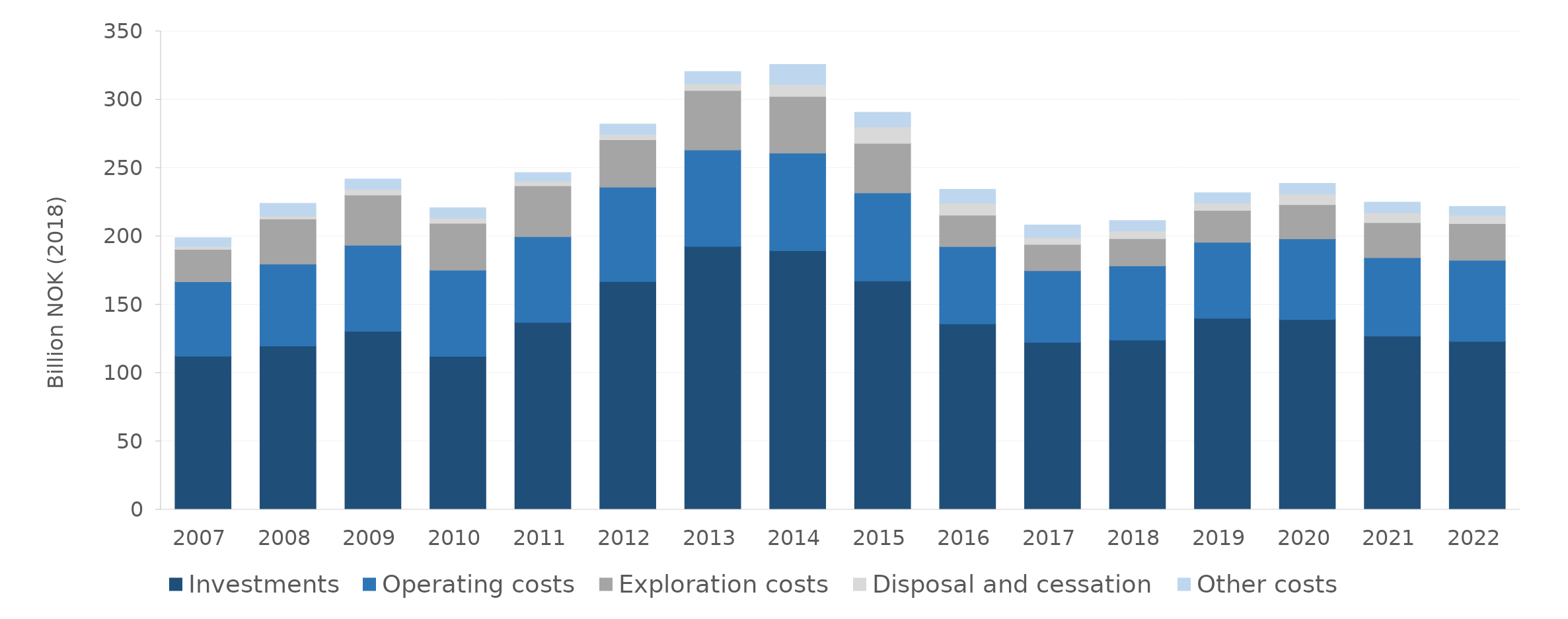
| Category | Investments | Operating costs | Exploration costs | Disposal and cessation | Other costs |
|---|---|---|---|---|---|
| 2007.0 | 112.216 | 54.606 | 23.682 | 1.963 | 6.54 |
| 2008.0 | 119.715 | 60.024 | 32.958 | 2.057 | 9.465 |
| 2009.0 | 130.506 | 63.036 | 36.634 | 4.306 | 7.532 |
| 2010.0 | 112.198 | 63.037 | 34.332 | 3.79 | 7.549 |
| 2011.0 | 137.025 | 62.763 | 37.163 | 3.491 | 6.24 |
| 2012.0 | 166.9 | 69.176 | 34.627 | 3.751 | 7.788 |
| 2013.0 | 192.666 | 70.523 | 43.582 | 4.75 | 9.087 |
| 2014.0 | 189.483 | 71.4 | 41.526 | 8.619 | 14.784 |
| 2015.0 | 167.382 | 64.391 | 36.322 | 12.006 | 10.695 |
| 2016.0 | 135.99 | 56.519 | 22.979 | 8.863 | 10.158 |
| 2017.0 | 122.392 | 52.448 | 19.22 | 5.241 | 9.065 |
| 2018.0 | 124.134 | 54.198 | 20.035 | 5.488 | 7.709 |
| 2019.0 | 140.068 | 55.596 | 23.346 | 5.427 | 7.517 |
| 2020.0 | 139.077 | 59.093 | 25.013 | 7.815 | 7.829 |
| 2021.0 | 127.056 | 57.403 | 25.564 | 7.211 | 7.781 |
| 2022.0 | 123.159 | 59.388 | 26.772 | 6.137 | 6.457 |